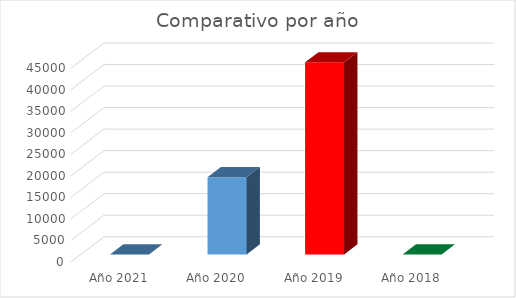
| Category | Series 0 |
|---|---|
| Año 2021 | 0 |
| Año 2020 | 17940.55 |
| Año 2019 | 44624.45 |
| Año 2018 | 0 |